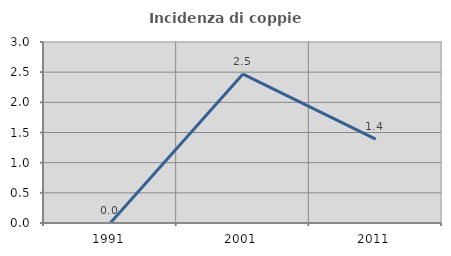
| Category | Incidenza di coppie miste |
|---|---|
| 1991.0 | 0 |
| 2001.0 | 2.469 |
| 2011.0 | 1.389 |